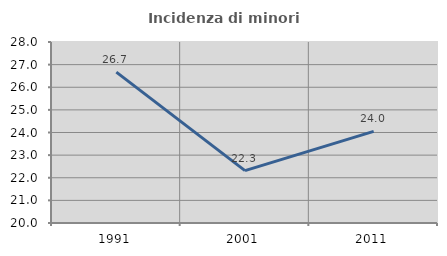
| Category | Incidenza di minori stranieri |
|---|---|
| 1991.0 | 26.667 |
| 2001.0 | 22.314 |
| 2011.0 | 24.048 |